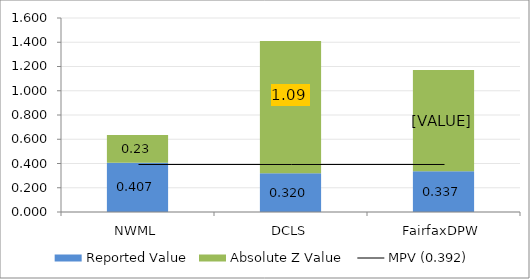
| Category | Reported Value | Absolute Z Value  |
|---|---|---|
| NWML | 0.407 | 0.227 |
| DCLS | 0.32 | 1.091 |
| FairfaxDPW | 0.337 | 0.833 |